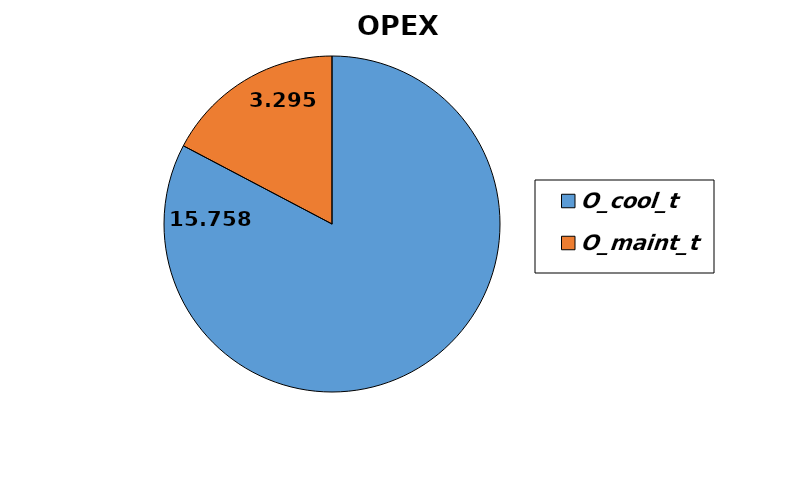
| Category | Series 0 |
|---|---|
| O_cool_t | 15.758 |
| O_maint_t | 3.295 |